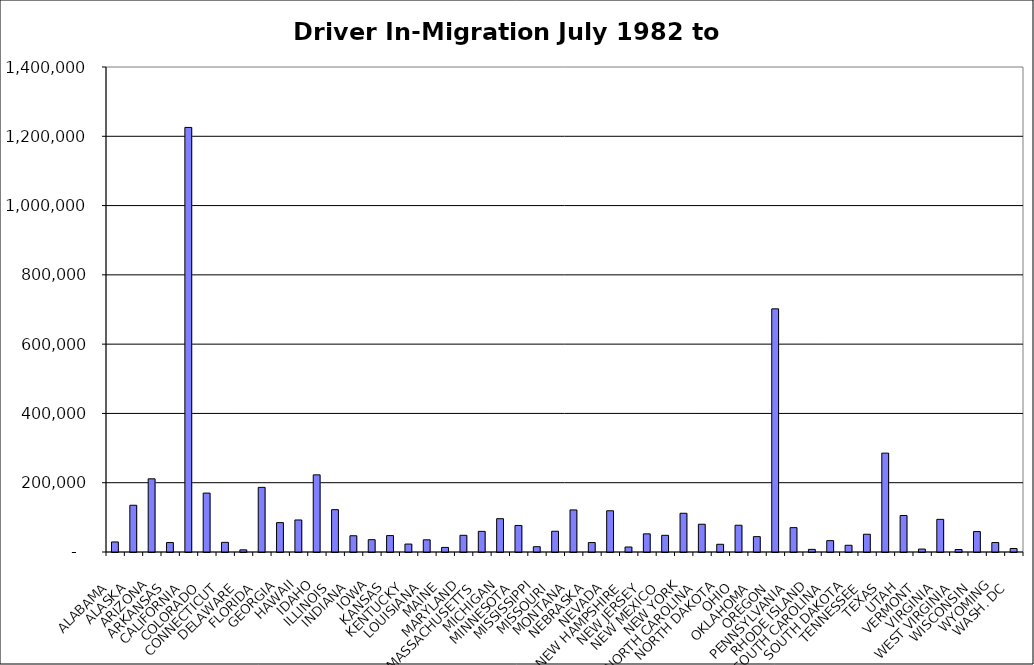
| Category | Series 0 |
|---|---|
|  ALABAMA  | 28996.5 |
|  ALASKA  | 134924.5 |
|  ARIZONA  | 211259 |
|  ARKANSAS  | 27275.5 |
|  CALIFORNIA  | 1225541.5 |
|  COLORADO  | 170083 |
|  CONNECTICUT  | 27888 |
|  DELAWARE  | 6203.5 |
|  FLORIDA  | 186552 |
|  GEORGIA  | 84779 |
|  HAWAII  | 92430.5 |
|  IDAHO  | 222669.5 |
|  ILLINOIS  | 122192.5 |
|  INDIANA  | 46901 |
|  IOWA  | 35579.5 |
|  KANSAS  | 47372.5 |
|  KENTUCKY  | 22949 |
|  LOUISIANA  | 35152.5 |
|  MAINE  | 13243.5 |
|  MARYLAND  | 48176 |
|  MASSACHUSETTS  | 59610 |
|  MICHIGAN  | 96123 |
|  MINNESOTA  | 76602.5 |
|  MISSISSIPPI  | 15273 |
|  MISSOURI  | 59910 |
|  MONTANA  | 121448 |
|  NEBRASKA  | 27237.5 |
|  NEVADA  | 119015 |
|  NEW HAMPSHIRE  | 14408.5 |
|  NEW JERSEY  | 52369 |
|  NEW MEXICO  | 48167 |
|  NEW YORK  | 111778 |
|  NORTH CAROLINA  | 80115.5 |
|  NORTH DAKOTA  | 22257.5 |
|  OHIO  | 77238.5 |
|  OKLAHOMA  | 44338 |
|  OREGON  | 701886 |
|  PENNSYLVANIA  | 70329.5 |
|  RHODE ISLAND  | 7595 |
|  SOUTH CAROLINA  | 32804.5 |
|  SOUTH DAKOTA  | 19399.5 |
|  TENNESSEE  | 51231.5 |
|  TEXAS  | 285380 |
|  UTAH  | 105299.5 |
|  VERMONT  | 8480 |
|  VIRGINIA  | 94243 |
|  WEST VIRGINIA  | 7147.5 |
|  WISCONSIN  | 58940.5 |
|  WYOMING  | 27317 |
|  WASH. DC  | 10120 |